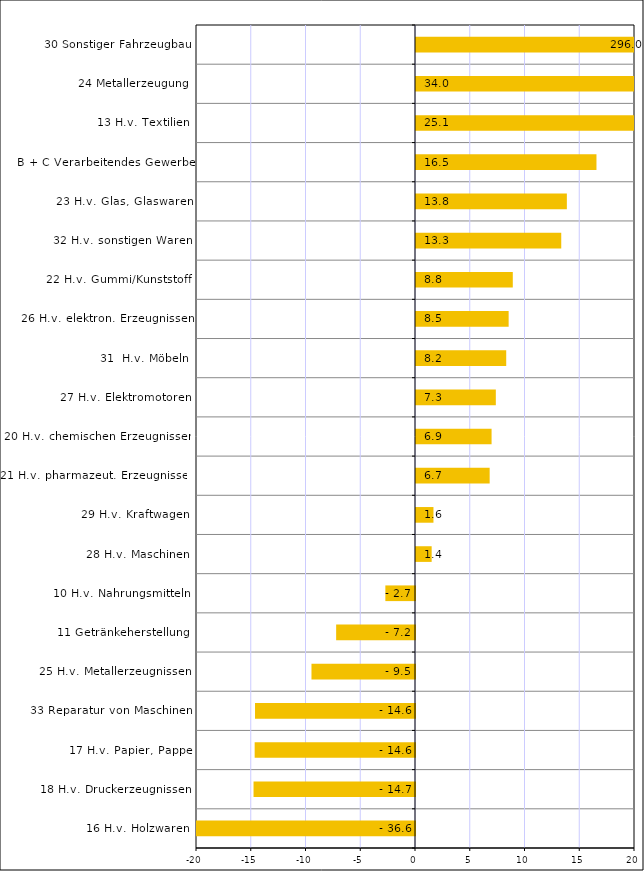
| Category | Series 0 |
|---|---|
| 16 H.v. Holzwaren | -36.57 |
| 18 H.v. Druckerzeugnissen | -14.746 |
| 17 H.v. Papier, Pappe | -14.643 |
| 33 Reparatur von Maschinen | -14.61 |
| 25 H.v. Metallerzeugnissen | -9.454 |
| 11 Getränkeherstellung | -7.2 |
| 10 H.v. Nahrungsmitteln | -2.708 |
| 28 H.v. Maschinen | 1.43 |
| 29 H.v. Kraftwagen | 1.594 |
| 21 H.v. pharmazeut. Erzeugnissen | 6.727 |
| 20 H.v. chemischen Erzeugnissen | 6.902 |
| 27 H.v. Elektromotoren | 7.29 |
| 31  H.v. Möbeln | 8.239 |
| 26 H.v. elektron. Erzeugnissen | 8.461 |
| 22 H.v. Gummi/Kunststoff | 8.84 |
| 32 H.v. sonstigen Waren | 13.265 |
| 23 H.v. Glas, Glaswaren | 13.777 |
| B + C Verarbeitendes Gewerbe | 16.481 |
| 13 H.v. Textilien | 25.098 |
| 24 Metallerzeugung | 34.012 |
| 30 Sonstiger Fahrzeugbau | 295.994 |